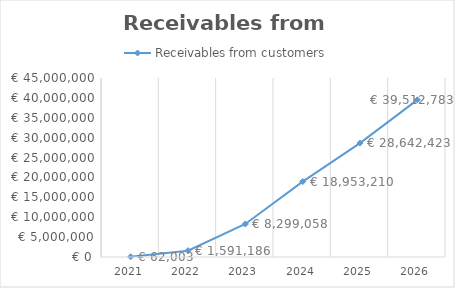
| Category | Receivables from customers |
|---|---|
| 2021.0 | 62002.74 |
| 2022.0 | 1591185.728 |
| 2023.0 | 8299058.094 |
| 2024.0 | 18953209.786 |
| 2025.0 | 28642422.862 |
| 2026.0 | 39512782.886 |